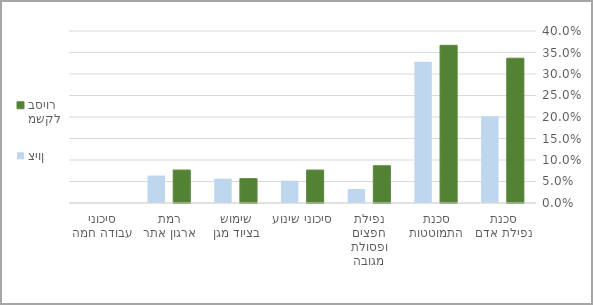
| Category | משקל בסיור | ציון |
|---|---|---|
| סכנת נפילת אדם | 0.337 | 0.202 |
| סכנת התמוטטות | 0.367 | 0.328 |
| נפילת חפצים ופסולת מגובה | 0.087 | 0.032 |
| סיכוני שינוע | 0.077 | 0.052 |
| שימוש בציוד מגן | 0.057 | 0.057 |
| רמת ארגון אתר | 0.077 | 0.064 |
| סיכוני עבודה חמה | 0 | 0 |